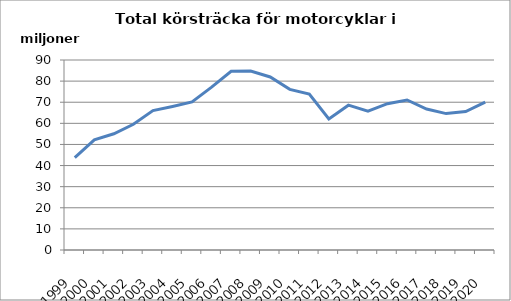
| Category | Series 0 |
|---|---|
| 1999.0 | 43759018.5 |
| 2000.0 | 52181330.9 |
| 2001.0 | 55070560.3 |
| 2002.0 | 59563146.5 |
| 2003.0 | 66034252.2 |
| 2004.0 | 67970980.7 |
| 2005.0 | 70113208.5 |
| 2006.0 | 77125282 |
| 2007.0 | 84622120.1 |
| 2008.0 | 84732017.6 |
| 2009.0 | 81950964.8 |
| 2010.0 | 76081708.7 |
| 2011.0 | 73838792.3 |
| 2012.0 | 62082106 |
| 2013.0 | 68600869.7 |
| 2014.0 | 65803999 |
| 2015.0 | 69320703 |
| 2016.0 | 71066755.4 |
| 2017.0 | 66774567 |
| 2018.0 | 64616300 |
| 2019.0 | 65574115 |
| 2020.0 | 70015396.6 |